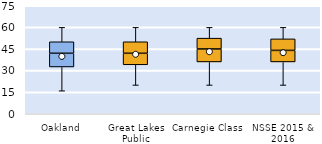
| Category | 25th | 50th | 75th |
|---|---|---|---|
| Oakland | 32.5 | 9.5 | 8 |
| Great Lakes Public | 34 | 8 | 8 |
| Carnegie Class | 36 | 9 | 7.5 |
| NSSE 2015 & 2016 | 36 | 8 | 8 |